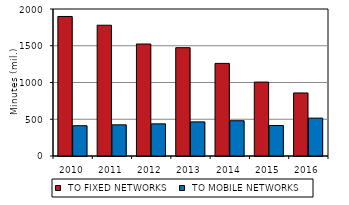
| Category |  TO FIXED NETWORKS |  TO MOBILE NETWORKS  |
|---|---|---|
| 2010.0 | 1898.209 | 411.793 |
| 2011.0 | 1779.139 | 424.105 |
| 2012.0 | 1523.696 | 437.311 |
| 2013.0 | 1473.838 | 464.104 |
| 2014.0 | 1259.793 | 479.999 |
| 2015.0 | 1005.727 | 414.876 |
| 2016.0 | 857.933 | 515.246 |